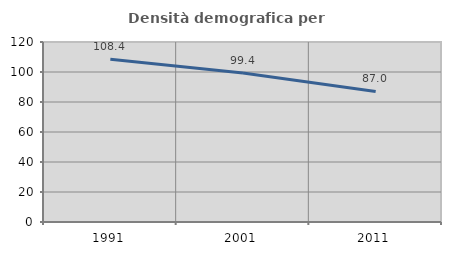
| Category | Densità demografica |
|---|---|
| 1991.0 | 108.441 |
| 2001.0 | 99.394 |
| 2011.0 | 87.046 |